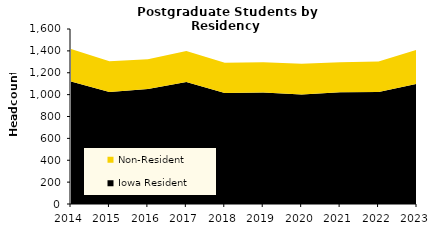
| Category | Iowa Resident | Non-Resident |
|---|---|---|
| 2014.0 | 1121 | 296 |
| 2015.0 | 1023 | 283 |
| 2016.0 | 1052 | 271 |
| 2017.0 | 1115 | 283 |
| 2018.0 | 1016 | 276 |
| 2019.0 | 1020 | 275 |
| 2020.0 | 1001 | 281 |
| 2021.0 | 1021 | 276 |
| 2022.0 | 1025 | 277 |
| 2023.0 | 1099 | 311 |